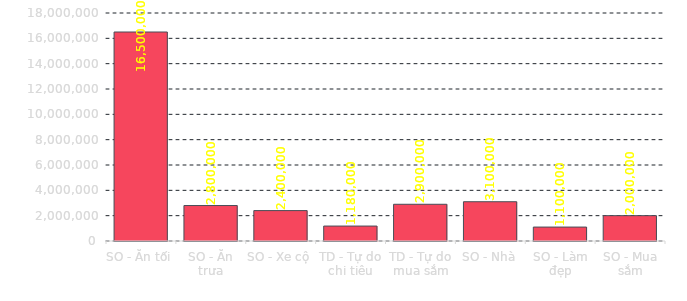
| Category | Total |
|---|---|
| SO - Ăn tối | 16500000 |
| SO - Ăn trưa | 2800000 |
| SO - Xe cộ | 2400000 |
| TD - Tự do chi tiêu | 1180000 |
| TD - Tự do mua sắm | 2900000 |
| SO - Nhà | 3100000 |
| SO - Làm đẹp | 1100000 |
| SO - Mua sắm | 2000000 |